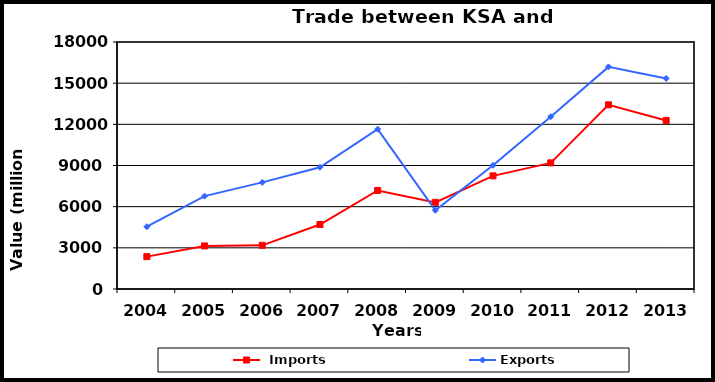
| Category |  Imports | Exports |
|---|---|---|
| 2004.0 | 2360 | 4539 |
| 2005.0 | 3139 | 6769 |
| 2006.0 | 3183 | 7771 |
| 2007.0 | 4699 | 8872 |
| 2008.0 | 7181 | 11650 |
| 2009.0 | 6314 | 5737 |
| 2010.0 | 8246 | 9012 |
| 2011.0 | 9192 | 12555 |
| 2012.0 | 13422 | 16187 |
| 2013.0 | 12283 | 15346 |